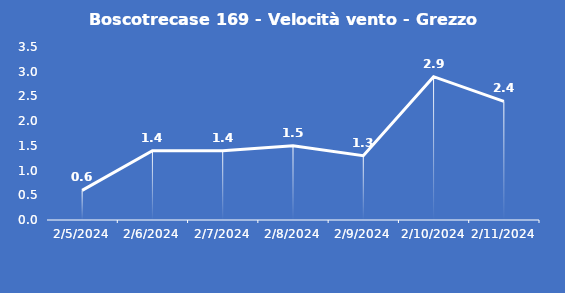
| Category | Boscotrecase 169 - Velocità vento - Grezzo (m/s) |
|---|---|
| 2/5/24 | 0.6 |
| 2/6/24 | 1.4 |
| 2/7/24 | 1.4 |
| 2/8/24 | 1.5 |
| 2/9/24 | 1.3 |
| 2/10/24 | 2.9 |
| 2/11/24 | 2.4 |